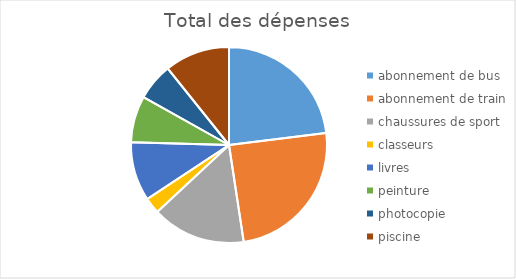
| Category | Series 0 |
|---|---|
| abonnement de bus | 225 |
| abonnement de train | 240 |
| chaussures de sport | 151 |
| classeurs | 26 |
| livres | 95 |
| peinture | 75 |
| photocopie | 60 |
| piscine | 105 |